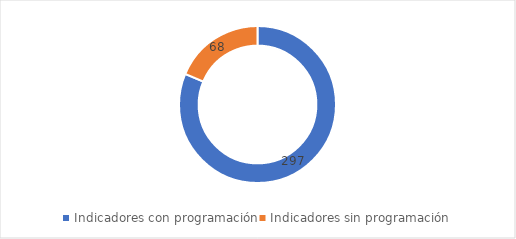
| Category | Series 0 |
|---|---|
| Indicadores con programación | 297 |
| Indicadores sin programación | 68 |